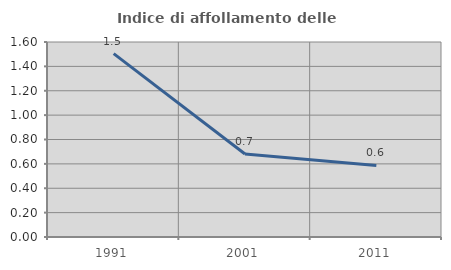
| Category | Indice di affollamento delle abitazioni  |
|---|---|
| 1991.0 | 1.505 |
| 2001.0 | 0.681 |
| 2011.0 | 0.587 |